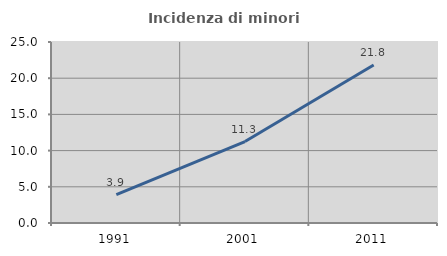
| Category | Incidenza di minori stranieri |
|---|---|
| 1991.0 | 3.922 |
| 2001.0 | 11.25 |
| 2011.0 | 21.833 |